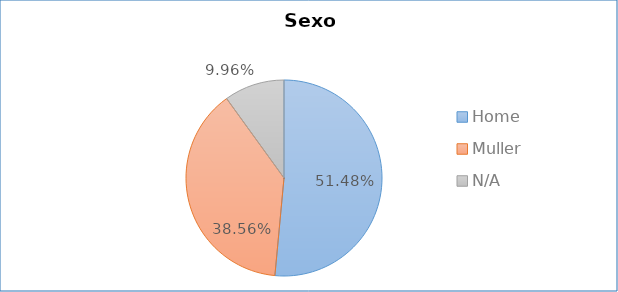
| Category | Sexo |
|---|---|
| Home | 0.515 |
| Muller | 0.386 |
| N/A | 0.1 |